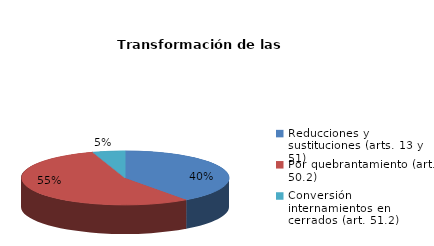
| Category | Series 0 |
|---|---|
| Reducciones y sustituciones (arts. 13 y 51) | 8 |
| Por quebrantamiento (art. 50.2) | 11 |
| Cancelaciones anticipadas | 0 |
| Traslado a Centros Penitenciarios | 0 |
| Conversión internamientos en cerrados (art. 51.2) | 1 |